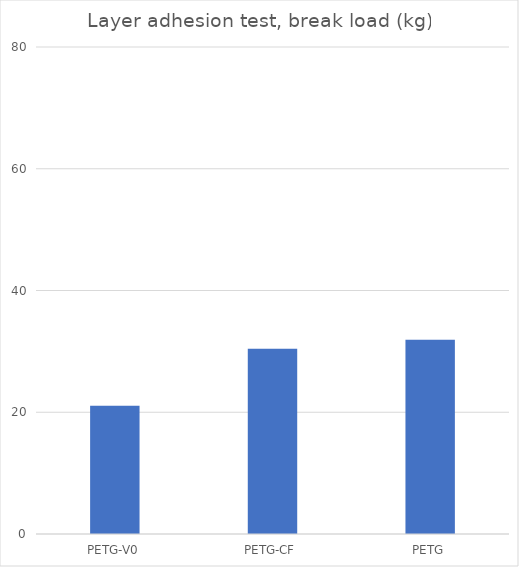
| Category | Average |
|---|---|
| PETG-V0 | 21.05 |
| PETG-CF | 30.45 |
| PETG | 31.9 |